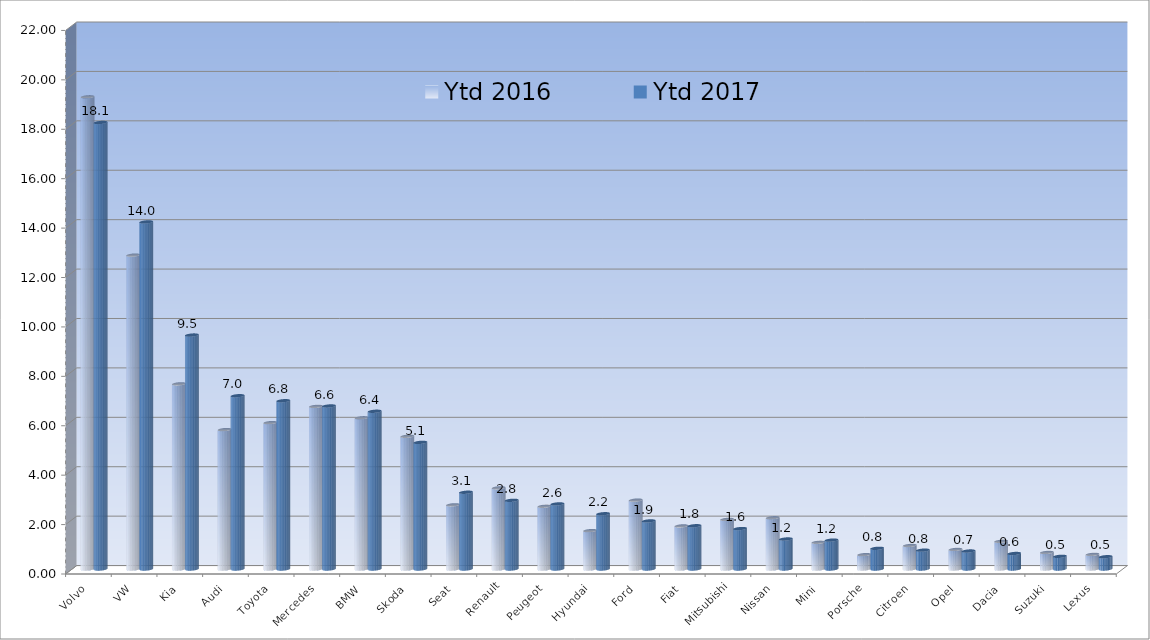
| Category | Ytd 2016 | Ytd 2017 |
|---|---|---|
| Volvo | 19.112 | 18.072 |
| VW | 12.704 | 14.047 |
| Kia | 7.493 | 9.469 |
| Audi | 5.642 | 7.013 |
| Toyota | 5.925 | 6.811 |
| Mercedes | 6.581 | 6.599 |
| BMW | 6.12 | 6.384 |
| Skoda | 5.371 | 5.125 |
| Seat | 2.597 | 3.107 |
| Renault | 3.286 | 2.78 |
| Peugeot | 2.539 | 2.634 |
| Hyundai | 1.553 | 2.236 |
| Ford | 2.788 | 1.946 |
| Fiat | 1.743 | 1.751 |
| Mitsubishi | 2.009 | 1.636 |
| Nissan | 2.074 | 1.215 |
| Mini | 1.081 | 1.169 |
| Porsche | 0.581 | 0.837 |
| Citroen | 0.952 | 0.763 |
| Opel | 0.792 | 0.728 |
| Dacia | 1.122 | 0.627 |
| Suzuki | 0.67 | 0.512 |
| Lexus | 0.592 | 0.497 |